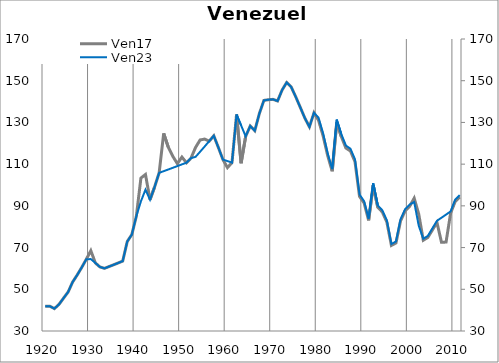
| Category | Ven17 |
|---|---|
| 1920.0 | 41.88 |
| 1921.0 | 41.88 |
| 1922.0 | 40.74 |
| 1923.0 | 42.728 |
| 1924.0 | 45.721 |
| 1925.0 | 48.628 |
| 1926.0 | 53.46 |
| 1927.0 | 56.814 |
| 1928.0 | 60.474 |
| 1929.0 | 64.37 |
| 1930.0 | 68.518 |
| 1931.0 | 62.638 |
| 1932.0 | 60.698 |
| 1933.0 | 60.043 |
| 1934.0 | 60.89 |
| 1935.0 | 61.749 |
| 1936.0 | 62.62 |
| 1937.0 | 63.515 |
| 1938.0 | 72.901 |
| 1939.0 | 76.222 |
| 1940.0 | 85.098 |
| 1941.0 | 103.325 |
| 1942.0 | 105.047 |
| 1943.0 | 92.943 |
| 1944.0 | 99.036 |
| 1945.0 | 105.841 |
| 1946.0 | 124.777 |
| 1947.0 | 118.138 |
| 1948.0 | 113.763 |
| 1949.0 | 110.245 |
| 1950.0 | 113.396 |
| 1951.0 | 110.687 |
| 1952.0 | 112.891 |
| 1953.0 | 118.036 |
| 1954.0 | 121.603 |
| 1955.0 | 122.015 |
| 1956.0 | 121.031 |
| 1957.0 | 123.606 |
| 1958.0 | 118.017 |
| 1959.0 | 112.208 |
| 1960.0 | 108.329 |
| 1961.0 | 110.739 |
| 1962.0 | 133.799 |
| 1963.0 | 110.433 |
| 1964.0 | 123.333 |
| 1965.0 | 128.266 |
| 1966.0 | 126.057 |
| 1967.0 | 134.211 |
| 1968.0 | 140.547 |
| 1969.0 | 140.905 |
| 1970.0 | 141.072 |
| 1971.0 | 140.283 |
| 1972.0 | 145.529 |
| 1973.0 | 149.136 |
| 1974.0 | 146.984 |
| 1975.0 | 142.243 |
| 1976.0 | 137.189 |
| 1977.0 | 132.063 |
| 1978.0 | 127.869 |
| 1979.0 | 134.639 |
| 1980.0 | 130.98 |
| 1981.0 | 123.57 |
| 1982.0 | 114.177 |
| 1983.0 | 106.589 |
| 1984.0 | 130.055 |
| 1985.0 | 123.209 |
| 1986.0 | 117.785 |
| 1987.0 | 116.293 |
| 1988.0 | 111.239 |
| 1989.0 | 94.535 |
| 1990.0 | 91.382 |
| 1991.0 | 83.064 |
| 1992.0 | 99.927 |
| 1993.0 | 89.369 |
| 1994.0 | 87.052 |
| 1995.0 | 82.228 |
| 1996.0 | 71.024 |
| 1997.0 | 72.201 |
| 1998.0 | 82.721 |
| 1999.0 | 87.541 |
| 2000.0 | 89.742 |
| 2001.0 | 93.678 |
| 2002.0 | 86.042 |
| 2003.0 | 73.516 |
| 2004.0 | 74.854 |
| 2005.0 | 78.442 |
| 2006.0 | 82.028 |
| 2007.0 | 72.517 |
| 2008.0 | 72.643 |
| 2009.0 | 86.496 |
| 2010.0 | 92.066 |
| 2011.0 | 94.214 |